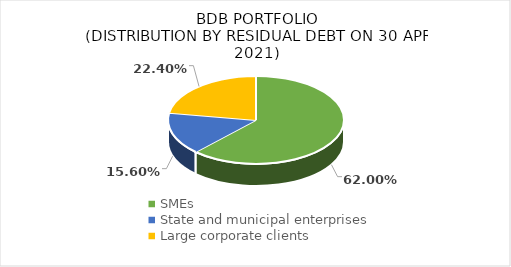
| Category | Series 0 |
|---|---|
| SMEs | 0.62 |
| State and municipal enterprises | 0.156 |
| Large corporate clients | 0.224 |